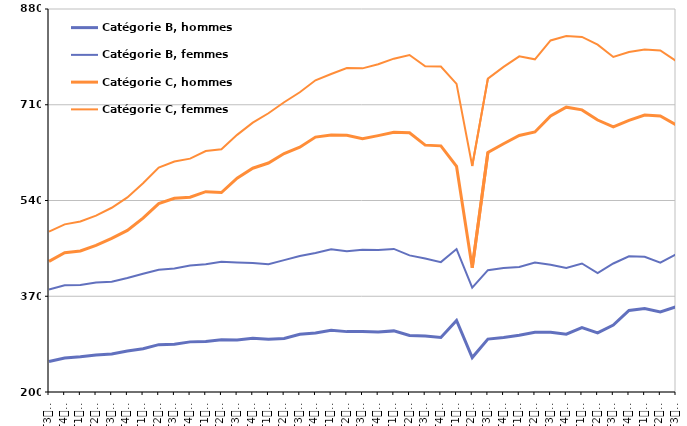
| Category | Catégorie B, hommes | Catégorie B, femmes | Catégorie C, hommes | Catégorie C, femmes |
|---|---|---|---|---|
| T3
2013 | 254.2 | 382 | 431.9 | 484.6 |
| T4
2013 | 260.2 | 389.4 | 447.3 | 497.6 |
| T1
2014 | 262.4 | 390.1 | 450.3 | 502.8 |
| T2
2014 | 265.7 | 394.6 | 460.2 | 513.1 |
| T3
2014 | 267.5 | 395.7 | 472.9 | 527.1 |
| T4
2014 | 272.8 | 402.4 | 486.8 | 545.4 |
| T1
2015 | 276.9 | 410 | 508.8 | 570.5 |
| T2
2015 | 284.1 | 417.1 | 534.4 | 598.5 |
| T3
2015 | 284.9 | 419.4 | 543.9 | 609.2 |
| T4
2015 | 289 | 424.5 | 545.8 | 614.3 |
| T1
2016 | 289.8 | 426.9 | 555.7 | 627.8 |
| T2
2016 | 292.6 | 431.1 | 554.2 | 631.1 |
| T3
2016 | 292.2 | 429.9 | 579.7 | 656.5 |
| T4
2016 | 295.5 | 429.1 | 597.3 | 678.2 |
| T1
2017 | 293.8 | 426.9 | 606.5 | 694.9 |
| T2
2017 | 295.1 | 434.1 | 623.3 | 714.5 |
| T3
2017 | 302.5 | 441.5 | 634.7 | 732.1 |
| T4
2017 | 304.6 | 446.8 | 652.6 | 753.4 |
| T1
2018 | 309.5 | 453.4 | 656.3 | 764.6 |
| T2
2018 | 307.2 | 449.8 | 655.8 | 775.2 |
| T3
2018 | 307.2 | 452.6 | 649.9 | 774.6 |
| T4
2018 | 306.4 | 452.1 | 655.2 | 781.8 |
| T1
2019 | 308.5 | 454 | 661 | 791.8 |
| T2
2019 | 300.3 | 442.6 | 660.2 | 798.4 |
| T3
2019 | 299.4 | 437.1 | 638.3 | 778.2 |
| T4
2019 | 296.8 | 430.6 | 637 | 777.9 |
| T1
2020 | 326.9 | 453.8 | 600.5 | 747.1 |
| T2
2020 | 261.1 | 385.4 | 420.7 | 601.3 |
| T3
2020 | 294 | 416.3 | 625.3 | 756.4 |
| T4
2020 | 296.9 | 420.3 | 640.8 | 777.3 |
| T1
2021 | 300.6 | 422.1 | 655.4 | 795.9 |
| T2
2021 | 306 | 429.7 | 661.7 | 790.6 |
| T3
2021 | 306.2 | 425.8 | 690.1 | 824.1 |
| T4
2021 | 302.6 | 420.3 | 705.7 | 832.1 |
| T1
2022 | 314.2 | 428.2 | 700.9 | 830.4 |
| T2
2022 | 305.1 | 411.3 | 682.9 | 816.7 |
| T3
2022 | 318.8 | 428.2 | 670.6 | 794.9 |
| T4
2022 | 344.7 | 440.9 | 682.2 | 803.7 |
| T1
2023 | 348.2 | 440 | 691.7 | 808.2 |
| T2
2023 | 342.2 | 429.6 | 690 | 806.3 |
| T3
2023 | 351.2 | 444.3 | 674.5 | 787.7 |